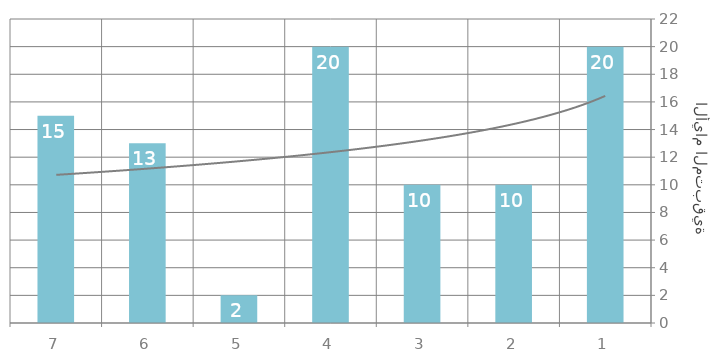
| Category | الإجمالي |
|---|---|
| 1 | 20 |
| 2 | 10 |
| 3 | 10 |
| 4 | 20 |
| 5 | 2 |
| 6 | 13 |
| 7 | 15 |